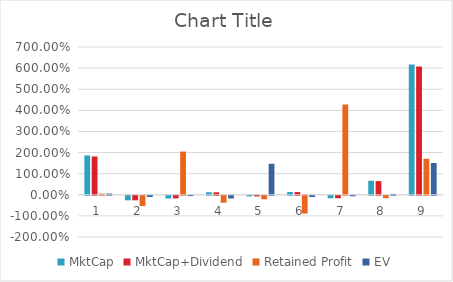
| Category | MktCap | MktCap+Dividend | Retained Profit | EV |
|---|---|---|---|---|
| 0 | 1.865 | 1.815 | 0.055 | 0.061 |
| 1 | -0.215 | -0.215 | -0.485 | -0.06 |
| 2 | -0.128 | -0.123 | 2.047 | -0.015 |
| 3 | 0.121 | 0.117 | -0.328 | -0.129 |
| 4 | -0.028 | -0.031 | -0.165 | 1.468 |
| 5 | 0.131 | 0.127 | -0.844 | -0.059 |
| 6 | -0.12 | -0.117 | 4.277 | -0.025 |
| 7 | 0.663 | 0.645 | -0.112 | 0.044 |
| 8 | 6.166 | 6.08 | 1.706 | 1.505 |